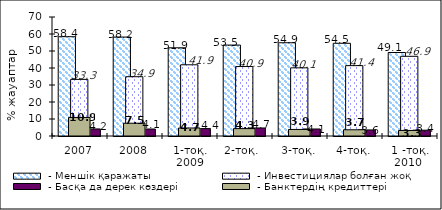
| Category |  - Меншік қаражаты |  - Инвестициялар болған жоқ  |  - Басқа да дерек көздері |
|---|---|---|---|
| 2007 | 58.405 | 33.305 | 4.158 |
| 2008 | 58.205 | 34.872 | 4.112 |
| 1-тоқ. 2009 | 51.89 | 41.89 | 4.36 |
| 2-тоқ.  | 53.49 | 40.86 | 4.72 |
| 3-тоқ. | 54.85 | 40.09 | 4.12 |
| 4-тоқ. | 54.54 | 41.39 | 3.56 |
| 1 -тоқ. 2010  | 49.11 | 46.88 | 3.41 |